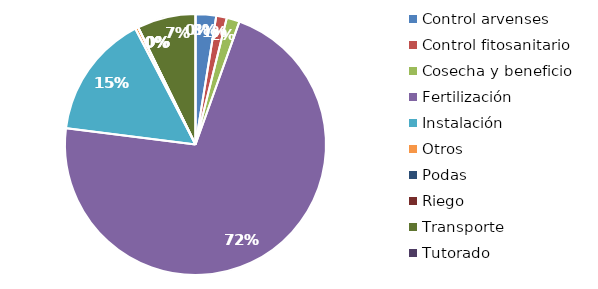
| Category | Valor |
|---|---|
| Control arvenses | 725952 |
| Control fitosanitario | 372450 |
| Cosecha y beneficio | 456899.363 |
| Fertilización | 20356840 |
| Instalación | 4374876.268 |
| Otros | 108786 |
| Podas | 0 |
| Riego | 0 |
| Transporte | 2062532 |
| Tutorado | 0 |